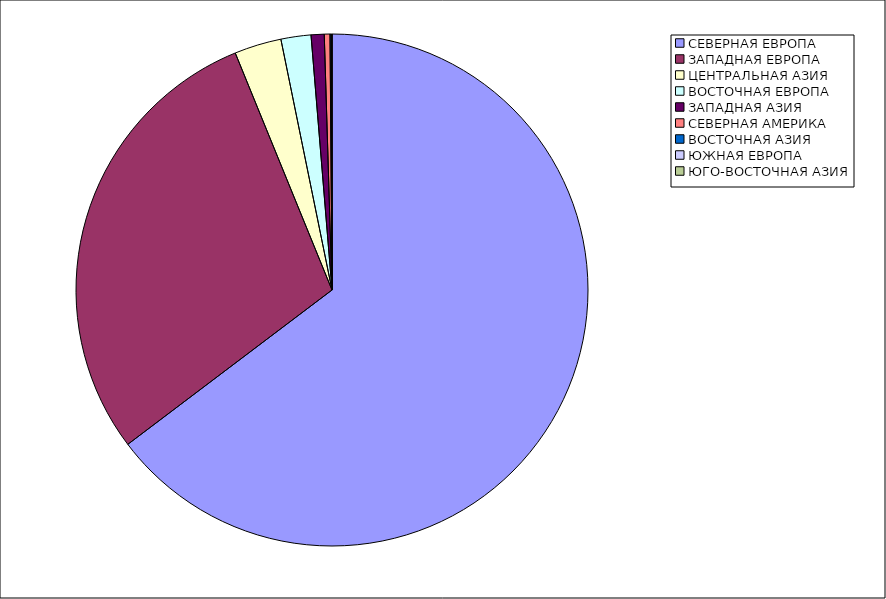
| Category | Оборот |
|---|---|
| СЕВЕРНАЯ ЕВРОПА | 64.698 |
| ЗАПАДНАЯ ЕВРОПА | 29.133 |
| ЦЕНТРАЛЬНАЯ АЗИЯ | 2.968 |
| ВОСТОЧНАЯ ЕВРОПА | 1.893 |
| ЗАПАДНАЯ АЗИЯ | 0.826 |
| СЕВЕРНАЯ АМЕРИКА | 0.359 |
| ВОСТОЧНАЯ АЗИЯ | 0.073 |
| ЮЖНАЯ ЕВРОПА | 0.049 |
| ЮГО-ВОСТОЧНАЯ АЗИЯ | 0.001 |